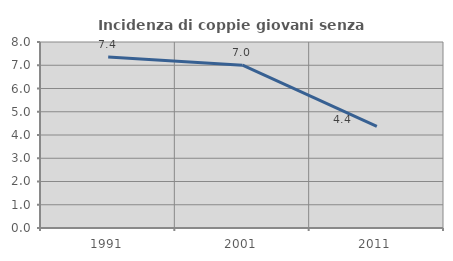
| Category | Incidenza di coppie giovani senza figli |
|---|---|
| 1991.0 | 7.351 |
| 2001.0 | 7.002 |
| 2011.0 | 4.373 |